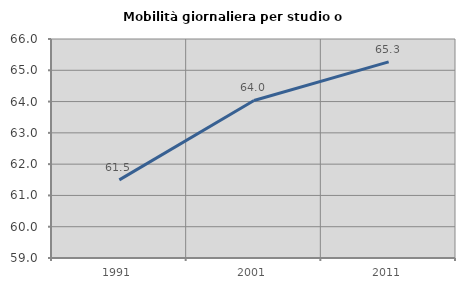
| Category | Mobilità giornaliera per studio o lavoro |
|---|---|
| 1991.0 | 61.497 |
| 2001.0 | 64.035 |
| 2011.0 | 65.268 |